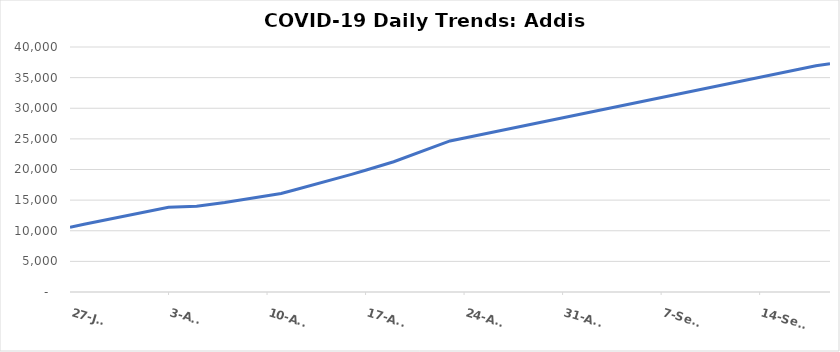
| Category | Addis Ababa |
|---|---|
| 2020-07-27 | 10583 |
| 2020-07-28 | 11076 |
| 2020-08-03 | 13826 |
| 2020-08-05 | 14005 |
| 2020-08-07 | 14607 |
| 2020-08-09 | 15352 |
| 2020-08-11 | 16086 |
| 2020-08-12 | 16698 |
| 2020-08-16 | 19207 |
| 2020-08-17 | 19881 |
| 2020-08-19 | 21266 |
| 2020-08-23 | 24659 |
| 2020-09-18 | 36939 |
| 2020-09-19 | 37278 |